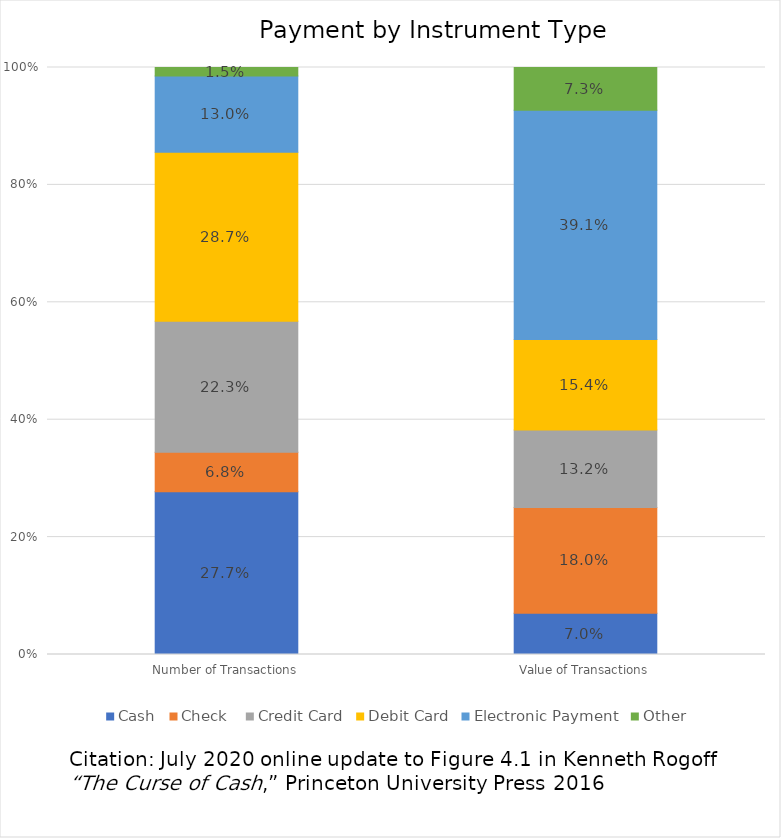
| Category | Cash | Check  | Credit Card | Debit Card | Electronic Payment | Other |
|---|---|---|---|---|---|---|
| Number of Transactions | 0.277 | 0.068 | 0.223 | 0.287 | 0.13 | 0.015 |
| Value of Transactions | 0.07 | 0.18 | 0.132 | 0.154 | 0.391 | 0.073 |